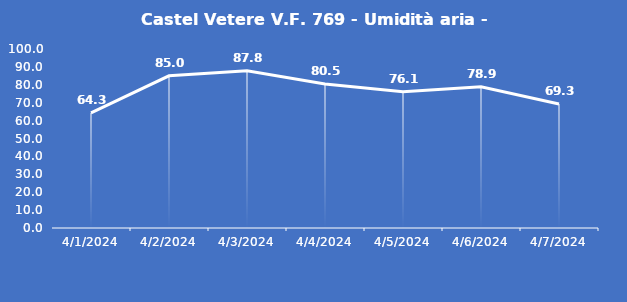
| Category | Castel Vetere V.F. 769 - Umidità aria - Grezzo (%) |
|---|---|
| 4/1/24 | 64.3 |
| 4/2/24 | 85 |
| 4/3/24 | 87.8 |
| 4/4/24 | 80.5 |
| 4/5/24 | 76.1 |
| 4/6/24 | 78.9 |
| 4/7/24 | 69.3 |